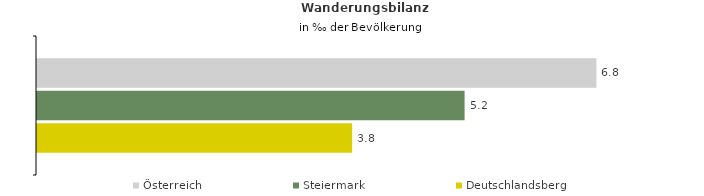
| Category | Österreich | Steiermark | Deutschlandsberg |
|---|---|---|---|
| Wanderungsrate in ‰ der Bevölkerung, Periode 2015-2019 | 6.771 | 5.175 | 3.814 |